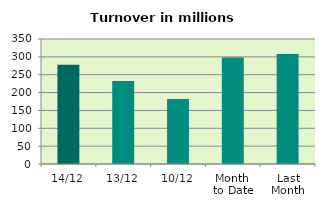
| Category | Series 0 |
|---|---|
| 14/12 | 278.216 |
| 13/12 | 232.597 |
| 10/12 | 181.652 |
| Month 
to Date | 298.064 |
| Last
Month | 307.664 |